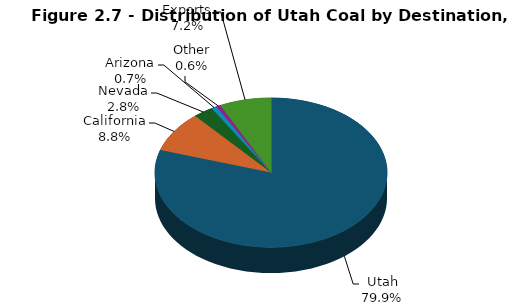
| Category | Series 0 |
|---|---|
| Utah | 11681 |
| California | 1285 |
| Nevada | 408 |
| Arizona | 107 |
| Other | 90 |
| Exports | 1049 |